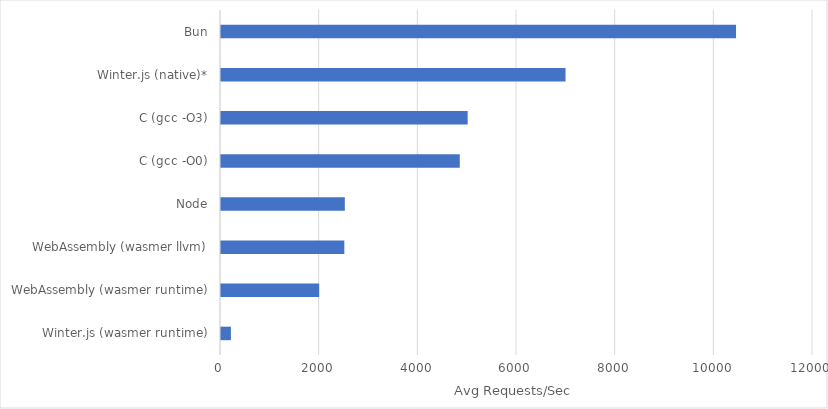
| Category | Req/Sec |
|---|---|
| Winter.js (wasmer runtime) | 200.83 |
| WebAssembly (wasmer runtime) | 1990 |
| WebAssembly (wasmer llvm) | 2500 |
| Node | 2510 |
| C (gcc -O0) | 4840 |
| C (gcc -O3) | 5000 |
| Winter.js (native)* | 6983.769 |
| Bun | 10440 |